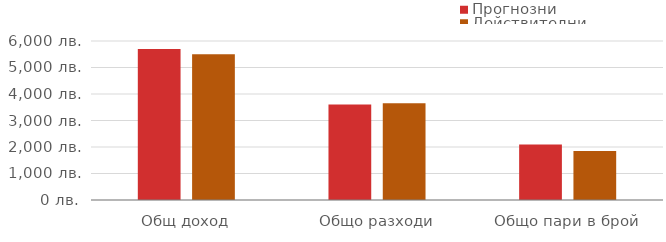
| Category | Прогнозни | Действителни |
|---|---|---|
| Общ доход | 5700 | 5500 |
| Общо разходи | 3603 | 3655 |
| Общо пари в брой | 2097 | 1845 |